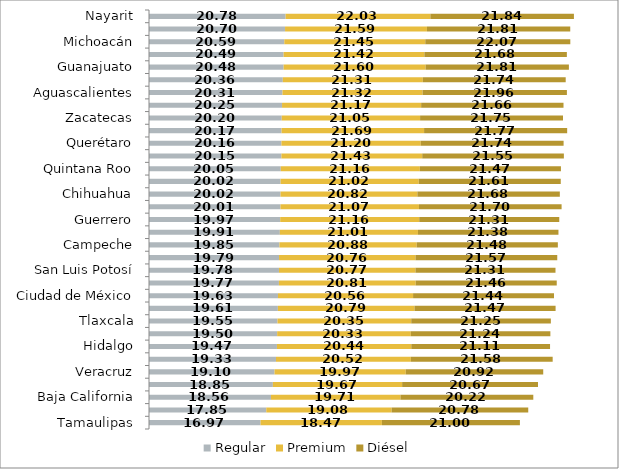
| Category | Regular | Premium | Diésel |
|---|---|---|---|
| Tamaulipas | 16.975 | 18.466 | 21.001 |
| Coahuila | 17.846 | 19.083 | 20.783 |
| Baja California | 18.559 | 19.707 | 20.215 |
| Tabasco | 18.852 | 19.671 | 20.673 |
| Veracruz | 19.103 | 19.972 | 20.916 |
| Sonora | 19.327 | 20.524 | 21.577 |
| Hidalgo | 19.473 | 20.442 | 21.115 |
| Puebla | 19.503 | 20.333 | 21.242 |
| Tlaxcala | 19.553 | 20.353 | 21.245 |
| Chiapas | 19.613 | 20.79 | 21.469 |
| Ciudad de México | 19.627 | 20.559 | 21.444 |
| Nacional | 19.773 | 20.814 | 21.46 |
| San Luis Potosí | 19.779 | 20.768 | 21.311 |
| Morelos | 19.789 | 20.764 | 21.573 |
| Campeche | 19.853 | 20.883 | 21.48 |
| Yucatán | 19.913 | 21.015 | 21.381 |
| Guerrero | 19.967 | 21.156 | 21.309 |
| Oaxaca | 20.009 | 21.074 | 21.704 |
| Chihuahua | 20.017 | 20.823 | 21.677 |
| Durango | 20.023 | 21.025 | 21.61 |
| Quintana Roo | 20.054 | 21.16 | 21.472 |
| Nuevo León | 20.15 | 21.429 | 21.554 |
| Querétaro | 20.156 | 21.198 | 21.737 |
| Sinaloa | 20.173 | 21.689 | 21.773 |
| Zacatecas | 20.198 | 21.055 | 21.747 |
| México | 20.246 | 21.167 | 21.663 |
| Aguascalientes | 20.31 | 21.323 | 21.961 |
| Baja California Sur | 20.364 | 21.305 | 21.741 |
| Guanajuato | 20.484 | 21.603 | 21.811 |
| Colima | 20.486 | 21.422 | 21.679 |
| Michoacán | 20.589 | 21.453 | 22.07 |
| Jalisco | 20.703 | 21.592 | 21.806 |
| Nayarit | 20.785 | 22.035 | 21.843 |